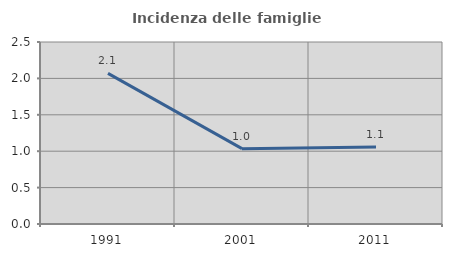
| Category | Incidenza delle famiglie numerose |
|---|---|
| 1991.0 | 2.069 |
| 2001.0 | 1.035 |
| 2011.0 | 1.058 |